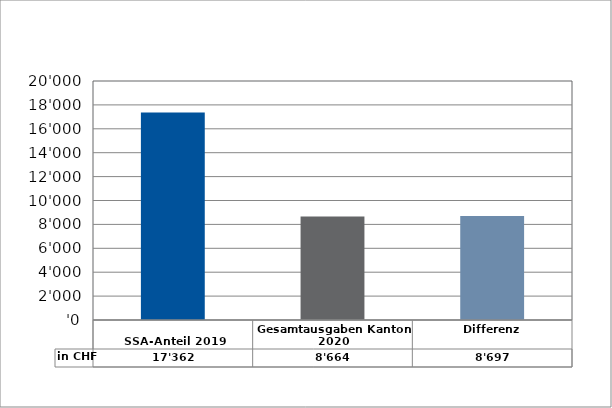
| Category | in CHF |
|---|---|
| 
SSA-Anteil 2019

 | 17361.7 |
| Gesamtausgaben Kanton 2020
 | 8664.35 |
| Differenz | 8697.35 |